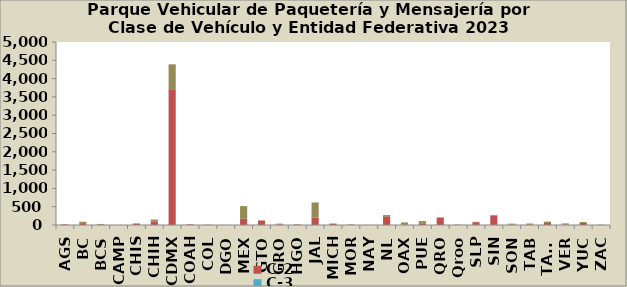
| Category | C-2 | C-3 | Camioneta |
|---|---|---|---|
| AGS | 18 | 0 | 0 |
| BC | 28 | 0 | 60 |
| BCS | 4 | 0 | 25 |
| CAMP | 2 | 0 | 0 |
| CHIS | 41 | 0 | 1 |
| CHIH | 100 | 0 | 48 |
| CDMX | 3711 | 0 | 678 |
| COAH | 16 | 0 | 7 |
| COL | 4 | 0 | 4 |
| DGO | 1 | 0 | 2 |
| MEX | 170 | 0 | 346 |
| GTO | 123 | 0 | 1 |
| GRO | 18 | 0 | 19 |
| HGO | 14 | 1 | 3 |
| JAL | 202 | 0 | 414 |
| MICH | 30 | 0 | 12 |
| MOR | 8 | 0 | 8 |
| NAY | 3 | 0 | 0 |
| NL | 221 | 1 | 49 |
| OAX | 5 | 0 | 65 |
| PUE | 48 | 0 | 58 |
| QRO | 202 | 0 | 6 |
| Qroo | 5 | 0 | 7 |
| SLP | 76 | 0 | 12 |
| SIN | 254 | 0 | 21 |
| SON | 8 | 0 | 29 |
| TAB | 10 | 0 | 31 |
| TAMS | 54 | 0 | 38 |
| VER | 13 | 0 | 31 |
| YUC | 56 | 0 | 26 |
| ZAC | 1 | 0 | 7 |